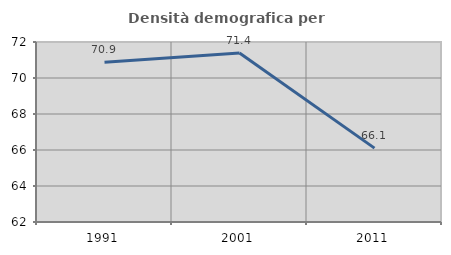
| Category | Densità demografica |
|---|---|
| 1991.0 | 70.877 |
| 2001.0 | 71.385 |
| 2011.0 | 66.105 |